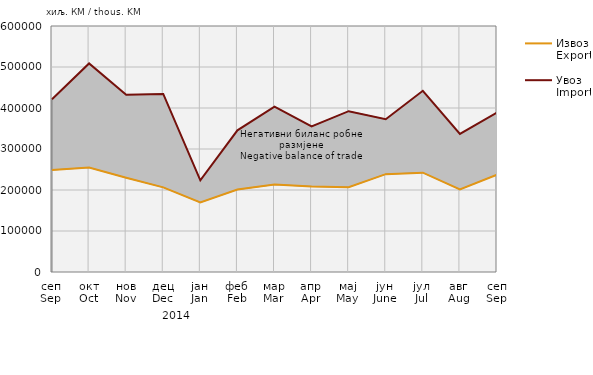
| Category | Извоз
Export | Увоз
Import |
|---|---|---|
| сеп
Sep | 248813 | 421218 |
| окт
Oct | 254767 | 508654 |
| нов
Nov | 229828 | 432236 |
| дец
Dec | 206415 | 434262 |
| јан
Jan | 169568 | 223487 |
| феб
Feb | 201039 | 345476 |
| мар
Mar | 213208 | 403130 |
| апр
Apr | 208576 | 354876 |
| мај
May | 206720 | 392249 |
| јун
June | 238696 | 372531 |
| јул
Jul | 242240 | 442007 |
| авг
Aug | 201362 | 336742 |
| сеп
Sep | 237427 | 388796 |